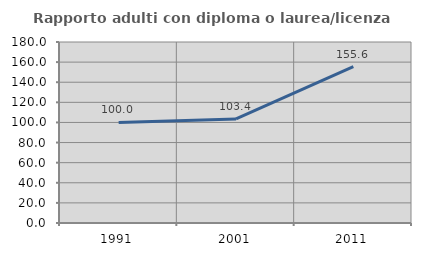
| Category | Rapporto adulti con diploma o laurea/licenza media  |
|---|---|
| 1991.0 | 100 |
| 2001.0 | 103.448 |
| 2011.0 | 155.556 |